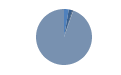
| Category | Series 0 |
|---|---|
| ARRASTRE | 75 |
| CERCO | 56 |
| PALANGRE | 13 |
| REDES DE ENMALLE | 2 |
| ARTES FIJAS | 1 |
| ARTES MENORES | 2584 |